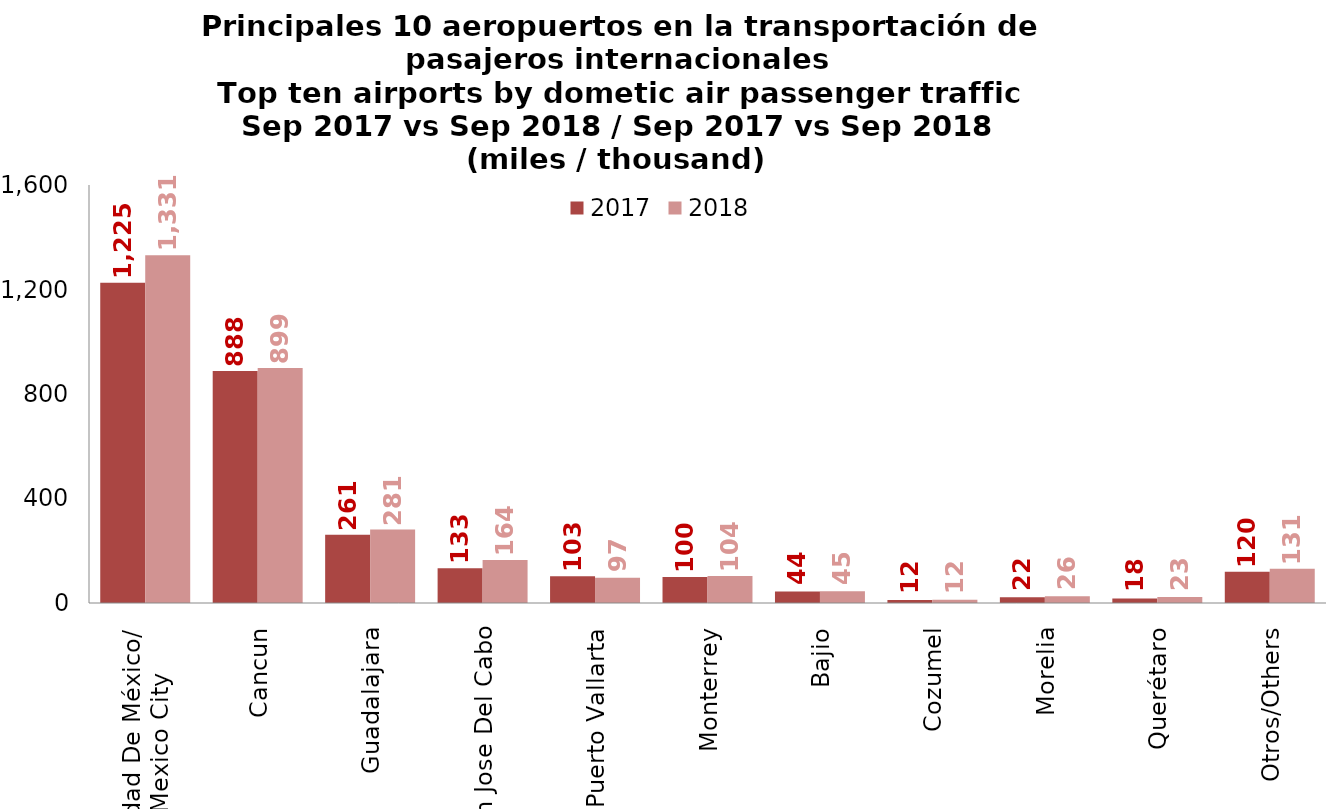
| Category | 2017 | 2018 |
|---|---|---|
| Ciudad De México/
Mexico City | 1225.48 | 1330.829 |
| Cancun | 888.386 | 899.471 |
| Guadalajara | 260.883 | 280.889 |
| San Jose Del Cabo | 133.35 | 164.356 |
| Puerto Vallarta | 102.659 | 96.786 |
| Monterrey | 99.955 | 103.519 |
| Bajio | 44.471 | 45.246 |
| Cozumel | 11.755 | 12.217 |
| Morelia | 21.537 | 25.588 |
| Querétaro | 17.504 | 23.162 |
| Otros/Others | 120.053 | 130.641 |